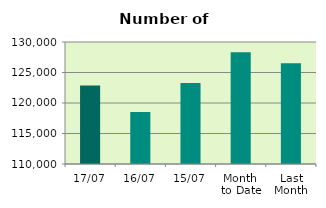
| Category | Series 0 |
|---|---|
| 17/07 | 122864 |
| 16/07 | 118518 |
| 15/07 | 123288 |
| Month 
to Date | 128339.846 |
| Last
Month | 126531 |